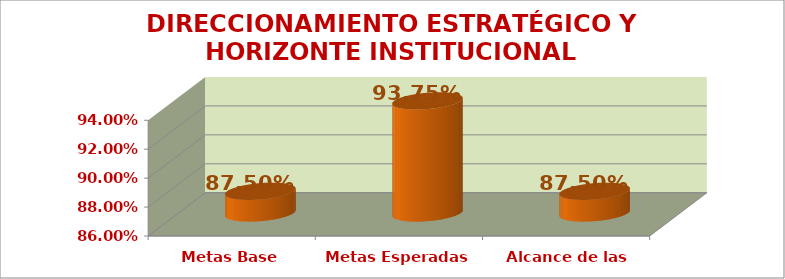
| Category | DIRECCIONAMIENTO ESTRATÉGICO Y HORIZONTE INSTITUCIONAL |
|---|---|
| Metas Base | 0.875 |
| Metas Esperadas | 0.938 |
| Alcance de las Metas | 0.875 |